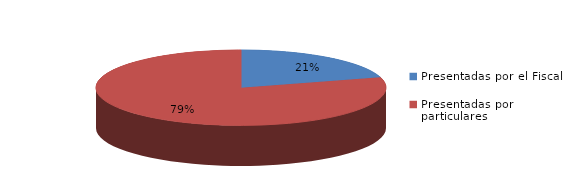
| Category | Series 0 |
|---|---|
| Presentadas por el Fiscal | 30 |
| Presentadas por particulares | 116 |